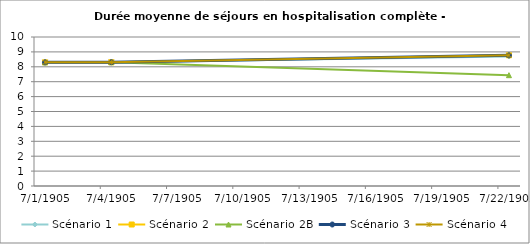
| Category | Scénario 1 | Scénario 2 | Scénario 2B | Scénario 3 | Scénario 4 |
|---|---|---|---|---|---|
| 2009.0 | 8.3 | 8.3 | 8.3 | 8.3 | 8.3 |
| 2012.0 | 8.307 | 8.307 | 8.307 | 8.307 | 8.307 |
| 2030.0 | 8.694 | 8.772 | 7.438 | 8.772 | 8.772 |